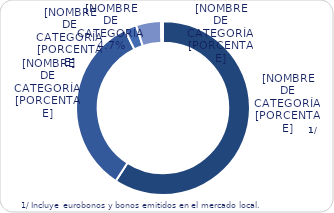
| Category | Series 0 |
|---|---|
| Inversionistas | 8980 |
| Multilateral | 5108 |
| Bilateral | 336.4 |
| BCR | 704.3 |
| Otros | 56.5 |